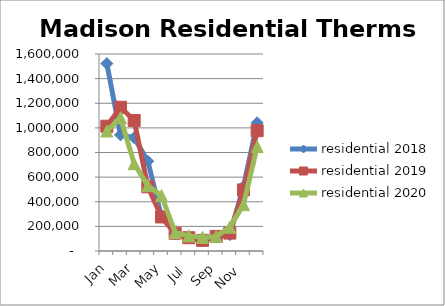
| Category | residential 2018 | residential 2019 | residential 2020 |
|---|---|---|---|
| Jan | 1522377 | 1013510 | 974530.157 |
| Feb | 942821 | 1167477 | 1082420.456 |
| Mar | 920355 | 1060233 | 709227.13 |
| Apr | 728989 | 521287 | 530629.881 |
| May | 276853 | 276453 | 449515.994 |
| Jun | 143493 | 144122 | 150601.955 |
| Jul | 104915 | 107882 | 122727.318 |
| Aug | 85617 | 86271 | 110455.199 |
| Sep | 113292 | 118488 | 117071.472 |
| Oct | 132498 | 145490 | 193749.271 |
| Nov | 523955 | 496321 | 376253.363 |
| Dec | 1041482 | 977017 | 847875.759 |